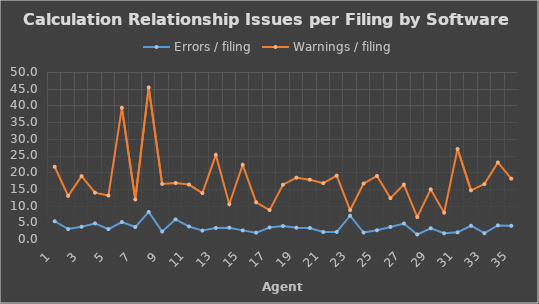
| Category | Errors / filing | Warnings / filing |
|---|---|---|
| 1.0 | 5.315 | 21.632 |
| 2.0 | 2.974 | 12.897 |
| 3.0 | 3.659 | 18.822 |
| 4.0 | 4.662 | 13.871 |
| 5.0 | 2.969 | 13.016 |
| 6.0 | 5.078 | 39.275 |
| 7.0 | 3.58 | 11.845 |
| 8.0 | 8.115 | 45.368 |
| 9.0 | 2.23 | 16.482 |
| 10.0 | 5.876 | 16.764 |
| 11.0 | 3.742 | 16.306 |
| 12.0 | 2.519 | 13.73 |
| 13.0 | 3.306 | 25.163 |
| 14.0 | 3.377 | 10.419 |
| 15.0 | 2.579 | 22.217 |
| 16.0 | 1.895 | 10.989 |
| 17.0 | 3.454 | 8.651 |
| 18.0 | 3.891 | 16.263 |
| 19.0 | 3.375 | 18.36 |
| 20.0 | 3.307 | 17.761 |
| 21.0 | 2.093 | 16.716 |
| 22.0 | 2.11 | 18.974 |
| 23.0 | 6.97 | 8.63 |
| 24.0 | 1.941 | 16.611 |
| 25.0 | 2.615 | 18.868 |
| 26.0 | 3.614 | 12.239 |
| 27.0 | 4.638 | 16.302 |
| 28.0 | 1.357 | 6.569 |
| 29.0 | 3.207 | 14.863 |
| 30.0 | 1.714 | 7.887 |
| 31.0 | 2 | 26.938 |
| 32.0 | 3.967 | 14.563 |
| 33.0 | 1.733 | 16.444 |
| 34.0 | 4.069 | 22.918 |
| 35.0 | 3.954 | 18.071 |